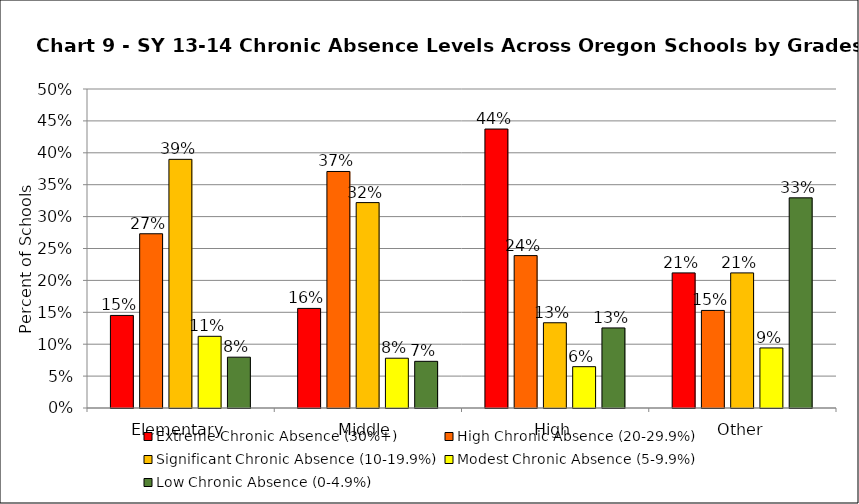
| Category | Extreme Chronic Absence (30%+) | High Chronic Absence (20-29.9%) | Significant Chronic Absence (10-19.9%) | Modest Chronic Absence (5-9.9%) | Low Chronic Absence (0-4.9%) |
|---|---|---|---|---|---|
| 0 | 0.145 | 0.273 | 0.39 | 0.112 | 0.08 |
| 1 | 0.156 | 0.371 | 0.322 | 0.078 | 0.073 |
| 2 | 0.437 | 0.239 | 0.134 | 0.065 | 0.126 |
| 3 | 0.212 | 0.153 | 0.212 | 0.094 | 0.329 |